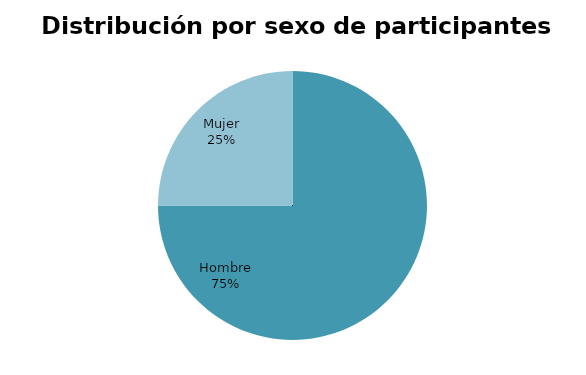
| Category | Series 0 |
|---|---|
| Hombre | 6 |
| Mujer | 2 |